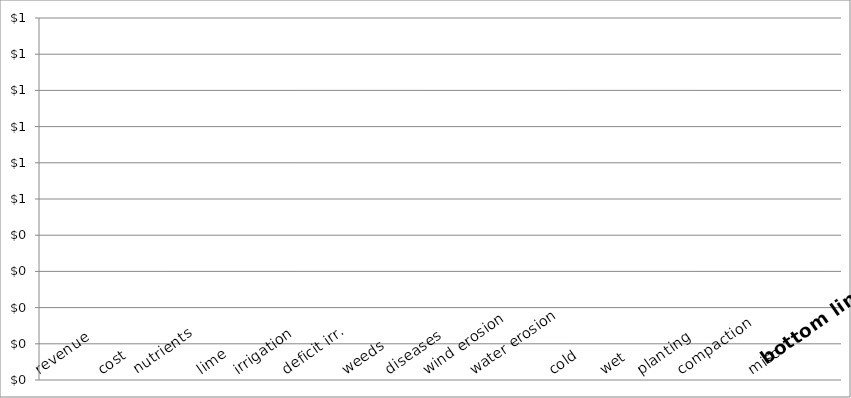
| Category | Series 0 |
|---|---|
| revenue | 0 |
| cost | 0 |
| nutrients | 0 |
| lime | 0 |
| irrigation | 0 |
| deficit irr. | 0 |
| weeds | 0 |
| diseases | 0 |
| wind erosion | 0 |
| water erosion | 0 |
| cold | 0 |
| wet | 0 |
| planting | 0 |
| compaction | 0 |
| misc | 0 |
| bottom line | 0 |